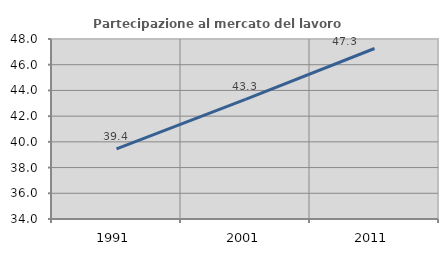
| Category | Partecipazione al mercato del lavoro  femminile |
|---|---|
| 1991.0 | 39.448 |
| 2001.0 | 43.298 |
| 2011.0 | 47.262 |